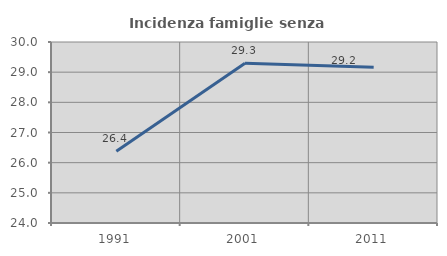
| Category | Incidenza famiglie senza nuclei |
|---|---|
| 1991.0 | 26.379 |
| 2001.0 | 29.295 |
| 2011.0 | 29.167 |